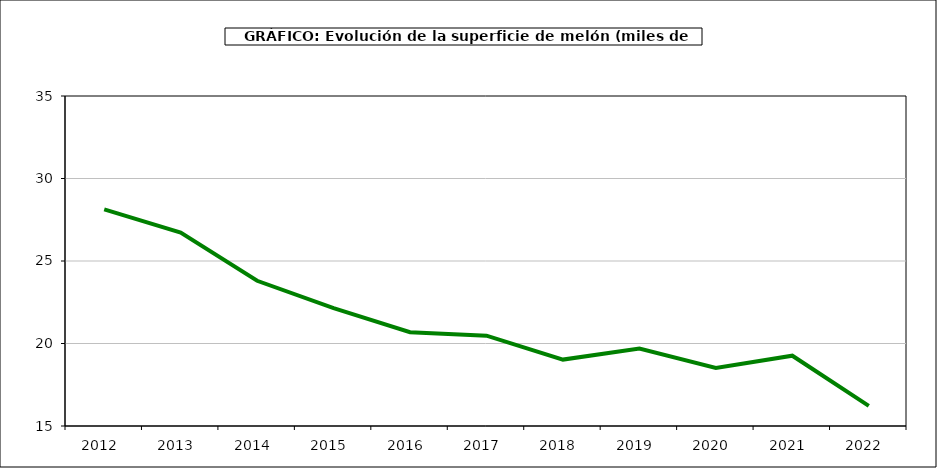
| Category | superficie |
|---|---|
| 2012.0 | 28.13 |
| 2013.0 | 26.723 |
| 2014.0 | 23.8 |
| 2015.0 | 22.144 |
| 2016.0 | 20.686 |
| 2017.0 | 20.473 |
| 2018.0 | 19.025 |
| 2019.0 | 19.691 |
| 2020.0 | 18.517 |
| 2021.0 | 19.26 |
| 2022.0 | 16.221 |